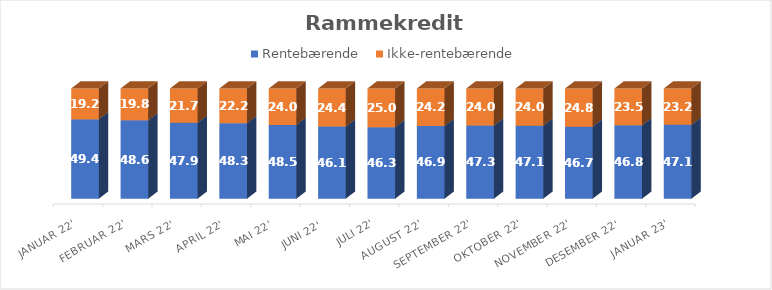
| Category | Rentebærende  | Ikke-rentebærende |
|---|---|---|
| Januar 22' | 49.355 | 19.225 |
| Februar 22' | 48.608 | 19.792 |
| Mars 22' | 47.935 | 21.682 |
| April 22' | 48.286 | 22.161 |
| Mai 22' | 48.45 | 23.957 |
| Juni 22' | 46.143 | 24.368 |
| Juli 22' | 46.26 | 24.999 |
| August 22' | 46.916 | 24.249 |
| September 22' | 47.263 | 23.958 |
| Oktober 22' | 47.094 | 23.968 |
| November 22' | 46.709 | 24.757 |
| Desember 22' | 46.814 | 23.494 |
| Januar 23' | 47.095 | 23.161 |